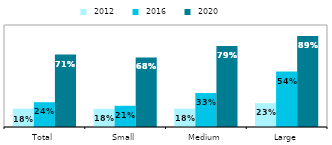
| Category |  2012 |  2016 |  2020 |
|---|---|---|---|
| Total | 0.18 | 0.243 | 0.71 |
| Small | 0.178 | 0.208 | 0.682 |
| Medium | 0.18 | 0.333 | 0.794 |
| Large | 0.234 | 0.544 | 0.893 |